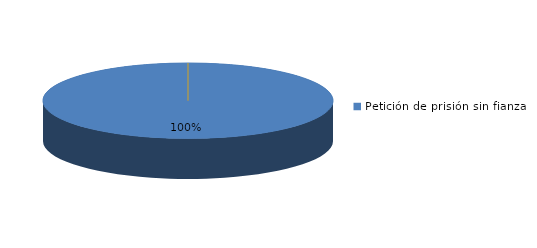
| Category | Series 0 |
|---|---|
| Petición de prisión sin fianza | 8 |
| Peticion de libertad con fianza | 0 |
| Petición de libertad | 0 |